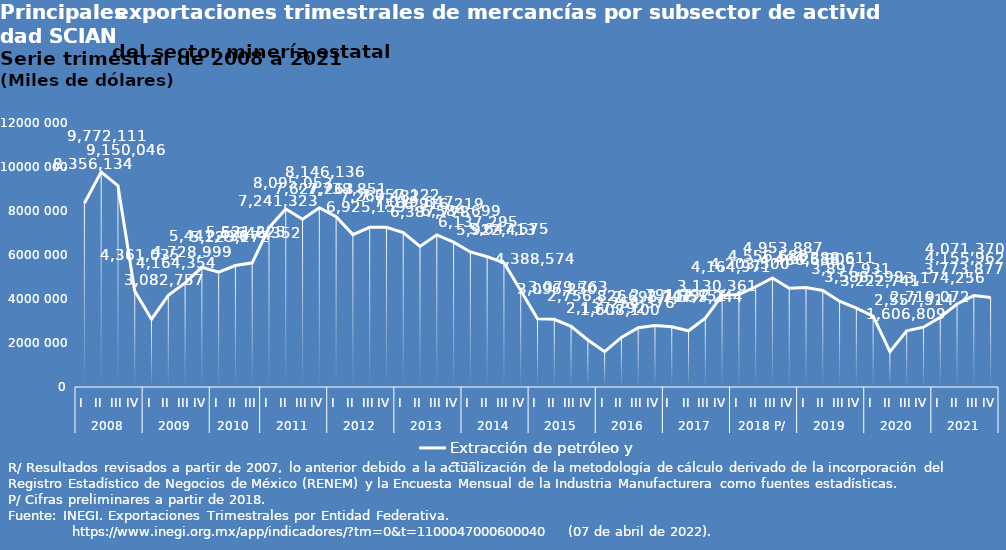
| Category | Extracción de petróleo y gas |
|---|---|
| 0 | 8356134 |
| 1 | 9772111 |
| 2 | 9150046 |
| 3 | 4361035 |
| 4 | 3082757 |
| 5 | 4164354 |
| 6 | 4728999 |
| 7 | 5441436 |
| 8 | 5223272 |
| 9 | 5521225 |
| 10 | 5646352 |
| 11 | 7241323 |
| 12 | 8095053 |
| 13 | 7627263 |
| 14 | 8146136 |
| 15 | 7738851 |
| 16 | 6925159 |
| 17 | 7260482 |
| 18 | 7257122 |
| 19 | 7019647 |
| 20 | 6387778 |
| 21 | 6916219 |
| 22 | 6584699 |
| 23 | 6137295 |
| 24 | 5922413 |
| 25 | 5647575 |
| 26 | 4388574 |
| 27 | 3096250 |
| 28 | 3079763 |
| 29 | 2756826 |
| 30 | 2137792 |
| 31 | 1608100 |
| 32 | 2254376 |
| 33 | 2695107 |
| 34 | 2791792 |
| 35 | 2741751 |
| 36 | 2555244 |
| 37 | 3130361 |
| 38 | 4164971 |
| 39 | 4203500 |
| 40 | 4556688 |
| 41 | 4953887 |
| 42 | 4486638 |
| 43 | 4525306 |
| 44 | 4388611 |
| 45 | 3897931 |
| 46 | 3588599 |
| 47 | 3222741 |
| 48 | 1606809 |
| 49 | 2557514 |
| 50 | 2719072 |
| 51 | 3174256 |
| 52 | 3773877 |
| 53 | 4155962 |
| 54 | 4071370 |